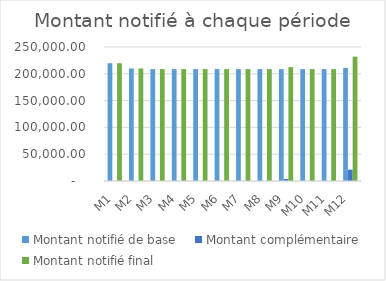
| Category | Montant notifié de base | Montant complémentaire | Montant notifié final |
|---|---|---|---|
| M1 | 219725.57 | 0 | 219725.57 |
| M2 | 209951.74 | 0 | 209951.74 |
| M3 | 208750 | 0 | 208750 |
| M4 | 208750 | 0 | 208750 |
| M5 | 208750 | 0 | 208750 |
| M6 | 208750 | 0 | 208750 |
| M7 | 208750 | 0 | 208750 |
| M8 | 208750 | 0 | 208750 |
| M9 | 208750 | 3625.08 | 212375.08 |
| M10 | 208750 | 0 | 208750 |
| M11 | 208750 | 0 | 208750 |
| M12 | 210837.5 | 21154.14 | 231991.64 |